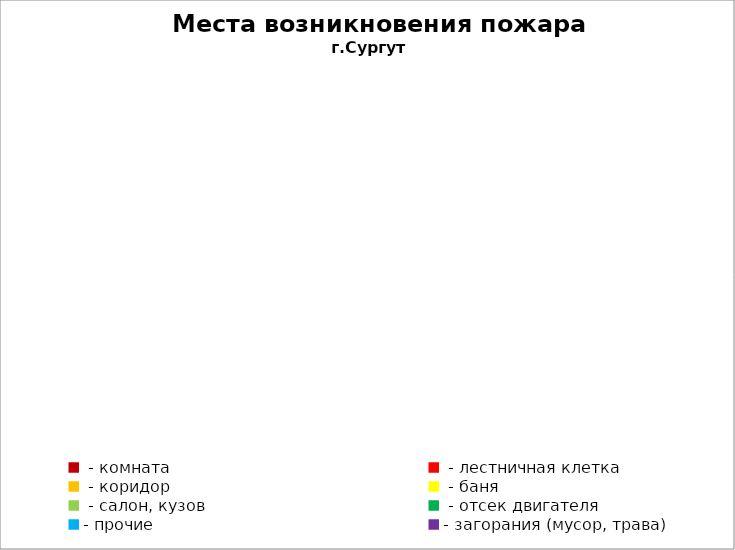
| Category | Места возникновения пожара |
|---|---|
|  - комната | 61 |
|  - лестничная клетка | 8 |
|  - коридор | 5 |
|  - баня | 30 |
|  - салон, кузов | 12 |
|  - отсек двигателя | 36 |
| - прочие | 103 |
| - загорания (мусор, трава)  | 40 |